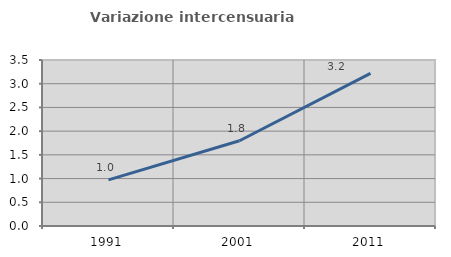
| Category | Variazione intercensuaria annua |
|---|---|
| 1991.0 | 0.972 |
| 2001.0 | 1.798 |
| 2011.0 | 3.218 |